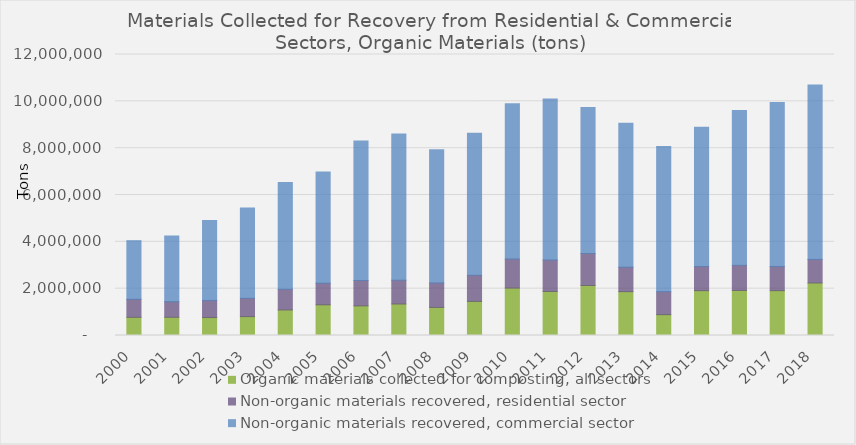
| Category | Organic materials collected for composting, all sectors | Non-organic materials recovered, residential sector | Non-organic materials recovered, commercial sector |
|---|---|---|---|
| 2000.0 | 775511 | 770314.07 | 2504086.03 |
| 2001.0 | 777407 | 667461.868 | 2808263.696 |
| 2002.0 | 766329 | 731521.942 | 3416769.799 |
| 2003.0 | 806163 | 781933.633 | 3854295.576 |
| 2004.0 | 1090516 | 882366.054 | 4557689.067 |
| 2005.0 | 1310965 | 924113.814 | 4745323.162 |
| 2006.0 | 1265321 | 1084727.156 | 5951892.375 |
| 2007.0 | 1345653 | 1015989.053 | 6248652.68 |
| 2008.0 | 1198497 | 1046046.175 | 5691607.643 |
| 2009.0 | 1456209 | 1115227.46 | 6069446.731 |
| 2010.0 | 2024732 | 1241825.394 | 6628614.581 |
| 2011.0 | 1880591 | 1344403.131 | 6877593.244 |
| 2012.0 | 2136570 | 1363220.05 | 6241907.243 |
| 2013.0 | 1872144 | 1045470.64 | 6143539.872 |
| 2014.0 | 890066 | 983075.603 | 6201419.88 |
| 2015.0 | 1914115 | 1033527.908 | 5940679.338 |
| 2016.0 | 1923792 | 1072939.508 | 6613319.997 |
| 2017.0 | 1914392 | 1032407.569 | 7000686.548 |
| 2018.0 | 2242289 | 1007776.734 | 7446353.42 |